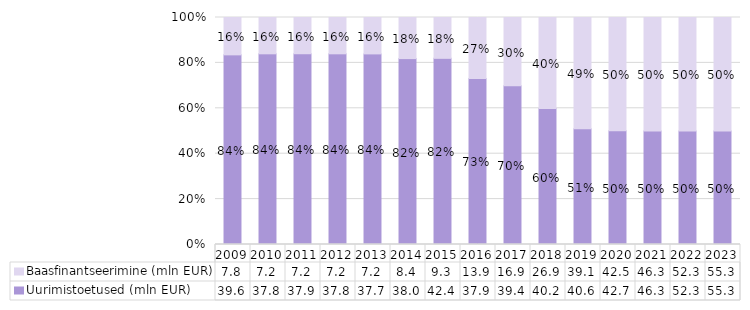
| Category | Uurimistoetused (mln EUR) | Baasfinantseerimine (mln EUR) |
|---|---|---|
| 2009.0 | 39.6 | 7.8 |
| 2010.0 | 37.8 | 7.2 |
| 2011.0 | 37.9 | 7.2 |
| 2012.0 | 37.8 | 7.2 |
| 2013.0 | 37.7 | 7.2 |
| 2014.0 | 38 | 8.4 |
| 2015.0 | 42.4 | 9.3 |
| 2016.0 | 37.9 | 13.9 |
| 2017.0 | 39.4 | 16.9 |
| 2018.0 | 40.2 | 26.9 |
| 2019.0 | 40.6 | 39.1 |
| 2020.0 | 42.7 | 42.5 |
| 2021.0 | 46.3 | 46.3 |
| 2022.0 | 52.3 | 52.3 |
| 2023.0 | 55.3 | 55.3 |